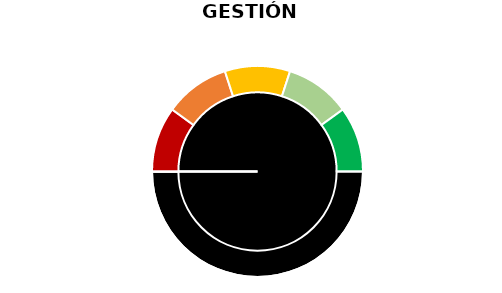
| Category | Puntero |
|---|---|
| 0 | 0 |
| 1 | 3 |
| 2 | 0 |